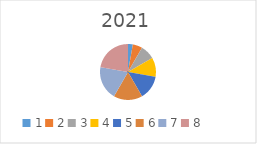
| Category | Series 0 | Series 1 |
|---|---|---|
| 0 | 1 | 1863501.26 |
| 1 | 2 | 2389824.12 |
| 2 | 3 | 15321 |
| 3 | 4 | 6415.47 |
| 4 | 5 | 1135690.34 |
| 5 | 6 | 398205.53 |
| 6 | 7 | 1185908.75 |
| 7 | 8 | 1666.98 |